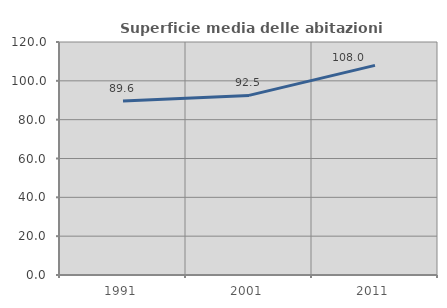
| Category | Superficie media delle abitazioni occupate |
|---|---|
| 1991.0 | 89.608 |
| 2001.0 | 92.508 |
| 2011.0 | 107.961 |